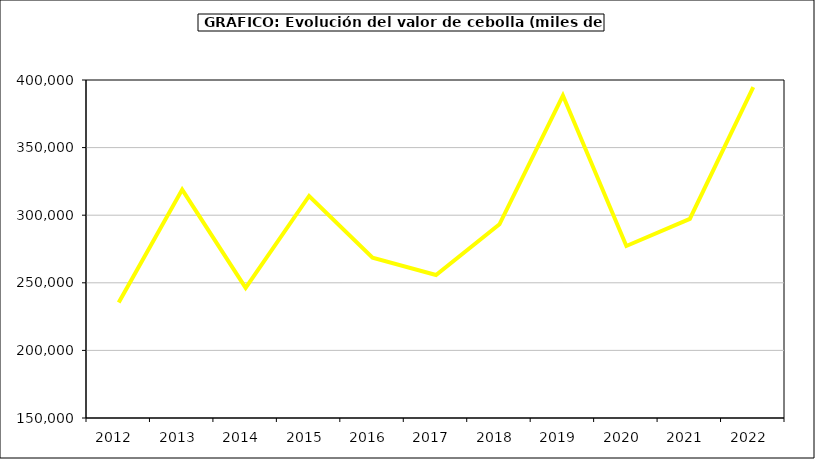
| Category | Valor |
|---|---|
| 2012.0 | 235464.837 |
| 2013.0 | 318927.963 |
| 2014.0 | 246223.118 |
| 2015.0 | 314225 |
| 2016.0 | 268515 |
| 2017.0 | 255748.291 |
| 2018.0 | 293282.611 |
| 2019.0 | 388505.94 |
| 2020.0 | 277230.916 |
| 2021.0 | 297223.368 |
| 2022.0 | 394656.571 |